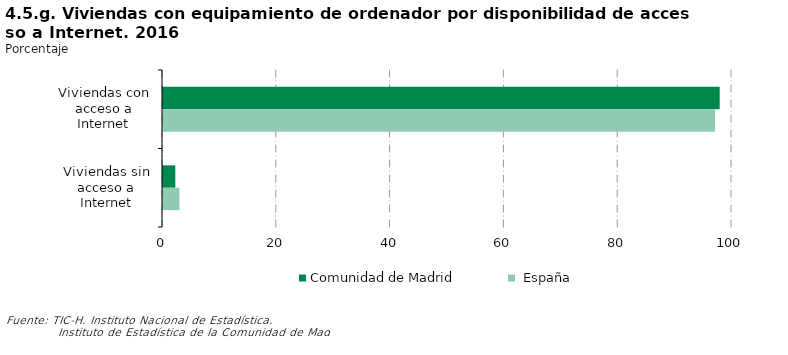
| Category | Comunidad de Madrid | España |
|---|---|---|
| Viviendas con acceso a Internet | 97.837 | 97.012 |
| Viviendas sin acceso a Internet | 2.163 | 2.893 |